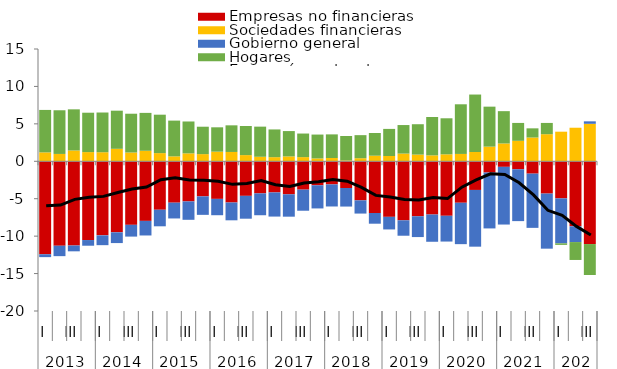
| Category | Empresas no financieras | Sociedades financieras | Gobierno general | Hogares |
|---|---|---|---|---|
| 0 | -12.421 | 1.191 | -0.383 | 5.67 |
| 1 | -11.282 | 0.982 | -1.391 | 5.835 |
| 2 | -11.252 | 1.443 | -0.775 | 5.497 |
| 3 | -10.52 | 1.228 | -0.759 | 5.261 |
| 4 | -9.895 | 1.21 | -1.31 | 5.306 |
| 5 | -9.487 | 1.668 | -1.439 | 5.093 |
| 6 | -8.488 | 1.176 | -1.572 | 5.178 |
| 7 | -7.962 | 1.404 | -1.949 | 5.062 |
| 8 | -6.474 | 1.091 | -2.211 | 5.134 |
| 9 | -5.529 | 0.659 | -2.109 | 4.775 |
| 10 | -5.359 | 1.06 | -2.459 | 4.258 |
| 11 | -4.687 | 0.957 | -2.469 | 3.661 |
| 12 | -5.022 | 1.285 | -2.183 | 3.254 |
| 13 | -5.506 | 1.246 | -2.379 | 3.557 |
| 14 | -4.617 | 0.825 | -3.053 | 3.891 |
| 15 | -4.288 | 0.604 | -2.92 | 4.025 |
| 16 | -4.159 | 0.55 | -3.226 | 3.704 |
| 17 | -4.411 | 0.652 | -2.989 | 3.384 |
| 18 | -3.787 | 0.556 | -2.818 | 3.151 |
| 19 | -3.208 | 0.381 | -3.09 | 3.189 |
| 20 | -3.088 | 0.44 | -2.95 | 3.154 |
| 21 | -3.569 | 0.121 | -2.479 | 3.262 |
| 22 | -5.22 | 0.412 | -1.764 | 3.08 |
| 23 | -6.912 | 0.746 | -1.426 | 3.037 |
| 24 | -7.421 | 0.706 | -1.684 | 3.62 |
| 25 | -7.883 | 1.03 | -2.062 | 3.811 |
| 26 | -7.344 | 0.894 | -2.78 | 4.057 |
| 27 | -7.111 | 0.793 | -3.64 | 5.124 |
| 28 | -7.281 | 0.93 | -3.442 | 4.814 |
| 29 | -5.541 | 0.981 | -5.529 | 6.633 |
| 30 | -3.829 | 1.237 | -7.578 | 7.679 |
| 31 | -1.502 | 1.958 | -7.467 | 5.34 |
| 32 | -0.742 | 2.381 | -7.708 | 4.316 |
| 33 | -1.065 | 2.735 | -6.928 | 2.388 |
| 34 | -1.651 | 3.176 | -7.243 | 1.224 |
| 35 | -4.315 | 3.619 | -7.358 | 1.504 |
| 36 | -4.954 | 3.954 | -6.01 | -0.204 |
| 37 | -8.684 | 4.483 | -2.108 | -2.389 |
| 38 | -11.057 | 5.009 | 0.328 | -4.135 |